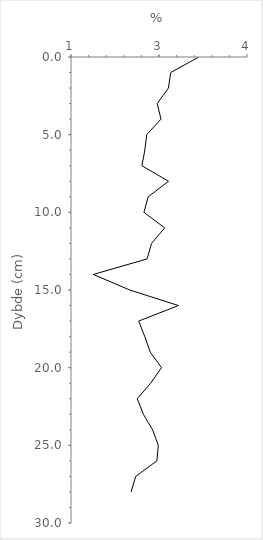
| Category | Series 0 |
|---|---|
| 3.178961820774237 | 0 |
| 2.699087565088606 | 1 |
| 2.6607432884303885 | 2 |
| 2.469503124070447 | 3 |
| 2.533726608965028 | 4 |
| 2.290828123661885 | 5 |
| 2.258243280686996 | 6 |
| 2.2087037903601576 | 7 |
| 2.6622619510299366 | 8 |
| 2.315371106386932 | 9 |
| 2.2429177434296848 | 10 |
| 2.597086195975259 | 11 |
| 2.373065704256776 | 12 |
| 2.296690198954818 | 13 |
| 1.3811153613852136 | 14 |
| 2.001218132776445 | 15 |
| 2.8316810799408985 | 16 |
| 2.1542911285097386 | 17 |
| 2.257562835499009 | 18 |
| 2.3512646954042906 | 19 |
| 2.5427056744551395 | 20 |
| 2.3579794644237424 | 21 |
| 2.128609705269577 | 22 |
| 2.233812241684743 | 23 |
| 2.3909354098032605 | 24 |
| 2.4884464984002617 | 25 |
| 2.464055768020459 | 26 |
| 2.1030300235207426 | 27 |
| 2.0236397921171867 | 28 |